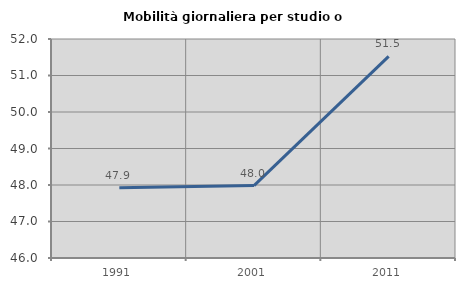
| Category | Mobilità giornaliera per studio o lavoro |
|---|---|
| 1991.0 | 47.925 |
| 2001.0 | 47.983 |
| 2011.0 | 51.523 |